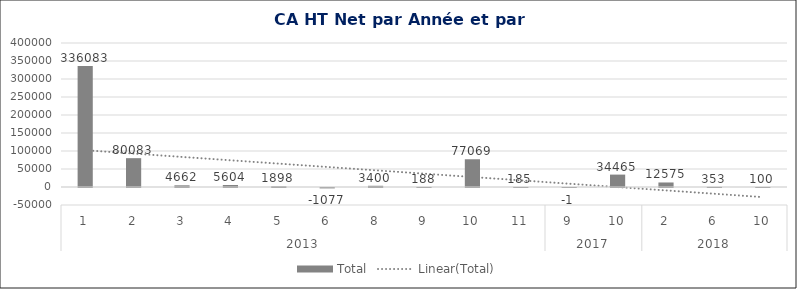
| Category | Total |
|---|---|
| 0 | 336082.78 |
| 1 | 80083.17 |
| 2 | 4662.07 |
| 3 | 5604.17 |
| 4 | 1898.42 |
| 5 | -1076.8 |
| 6 | 3400.07 |
| 7 | 188.16 |
| 8 | 77068.5 |
| 9 | 185 |
| 10 | -1.01 |
| 11 | 34465.06 |
| 12 | 12575 |
| 13 | 353.4 |
| 14 | 100 |